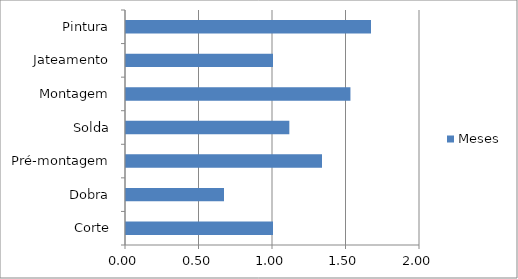
| Category | Meses |
|---|---|
| Corte | 1 |
| Dobra | 0.667 |
| Pré-montagem | 1.333 |
| Solda | 1.111 |
| Montagem | 1.527 |
| Jateamento | 1 |
| Pintura | 1.667 |